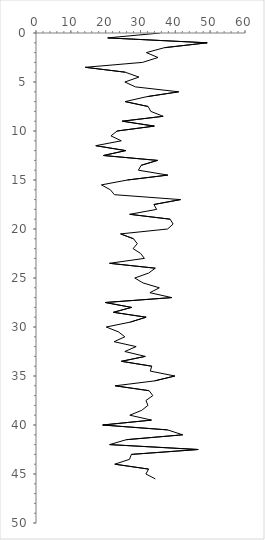
| Category | Series 0 |
|---|---|
| 35.666666666666664 | 0 |
| 20.586611456176673 | 0.5 |
| 49.145299145299134 | 1 |
| 36.852394916911045 | 1.5 |
| 31.68498168498169 | 2 |
| 35.026455026455025 | 2.5 |
| 30.555555555555557 | 3 |
| 14.15907710989678 | 3.5 |
| 25.612244897959183 | 4 |
| 29.542483660130717 | 4.5 |
| 25.4985754985755 | 5 |
| 28.565656565656568 | 5.5 |
| 40.95816464237517 | 6 |
| 31.774891774891774 | 6.5 |
| 25.59732664995823 | 7 |
| 32.196382428940574 | 7.5 |
| 32.95454545454546 | 8 |
| 36.507936507936506 | 8.5 |
| 24.76851851851852 | 9 |
| 33.96193696622881 | 9.5 |
| 23.267973856209153 | 10 |
| 21.525349650349654 | 10.5 |
| 24.49031600407747 | 11 |
| 17.165242165242166 | 11.5 |
| 25.75757575757576 | 12 |
| 19.347319347319345 | 12.5 |
| 34.87762237762238 | 13 |
| 30.191570881226056 | 13.5 |
| 29.393939393939394 | 14 |
| 37.84461152882206 | 14.5 |
| 26.221985599837748 | 15 |
| 18.780068728522338 | 15.5 |
| 21.35298563869992 | 16 |
| 22.516835016835017 | 16.5 |
| 41.48148148148148 | 17 |
| 33.84615384615385 | 17.5 |
| 34.63203463203464 | 18 |
| 26.893939393939394 | 18.5 |
| 38.51851851851852 | 19 |
| 39.36507936507937 | 19.5 |
| 37.77777777777778 | 20 |
| 24.28571428571429 | 20.5 |
| 28.01468291159013 | 21 |
| 29.074074074074076 | 21.5 |
| 27.87878787878788 | 22 |
| 30.050125313283207 | 22.5 |
| 31.11801242236025 | 23 |
| 21.11111111111111 | 23.5 |
| 34.2442645074224 | 24 |
| 32.323232323232325 | 24.5 |
| 28.356244145717834 | 25 |
| 30.70028011204482 | 25.5 |
| 35.402609086819616 | 26 |
| 32.69721171360516 | 26.5 |
| 38.97435897435898 | 27 |
| 19.88873699400015 | 27.5 |
| 27.400419287211736 | 28 |
| 22.222222222222225 | 28.5 |
| 31.611811391223153 | 29 |
| 27.065352387240797 | 29.5 |
| 20.161258948023654 | 30 |
| 23.677537550653952 | 30.5 |
| 25.505050505050505 | 31 |
| 22.425722425722427 | 31.5 |
| 28.75180375180375 | 32 |
| 25.50505050505051 | 32.5 |
| 31.383208505147408 | 33 |
| 24.512670565302145 | 33.5 |
| 33.23232323232323 | 34 |
| 32.808857808857816 | 34.5 |
| 39.86842105263158 | 35 |
| 34.02854681924449 | 35.5 |
| 22.72727272727273 | 36 |
| 32.47863247863248 | 36.5 |
| 33.535353535353536 | 37 |
| 31.565656565656568 | 37.5 |
| 32.136752136752136 | 38 |
| 30.354449472096533 | 38.5 |
| 26.933295602823502 | 39 |
| 33.152958152958156 | 39.5 |
| 19.145299145299145 | 40 |
| 37.77777777777778 | 40.5 |
| 42.121212121212125 | 41 |
| 25.925925925925924 | 41.5 |
| 21.127946127946128 | 42 |
| 46.560846560846564 | 42.5 |
| 27.38095238095238 | 43 |
| 26.85185185185185 | 43.5 |
| 22.61904761904762 | 44 |
| 32.323232323232325 | 44.5 |
| 31.55195681511471 | 45 |
| 34.25925925925926 | 45.5 |